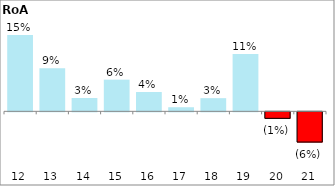
| Category | Series 0 |
|---|---|
| 2012-03-31 | 0.15 |
| 2013-03-31 | 0.085 |
| 2014-03-31 | 0.026 |
| 2015-03-31 | 0.063 |
| 2016-03-31 | 0.038 |
| 2017-03-31 | 0.008 |
| 2018-03-31 | 0.026 |
| 2019-03-31 | 0.113 |
| 2020-03-31 | -0.013 |
| 2021-03-31 | -0.06 |